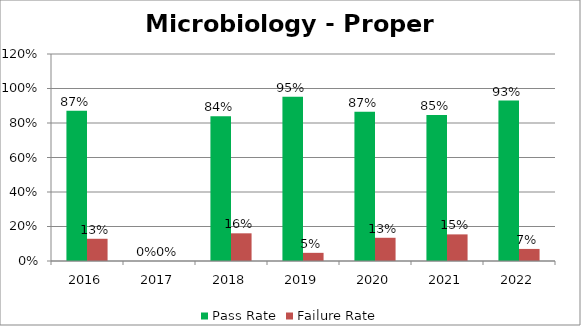
| Category | Pass Rate | Failure Rate |
|---|---|---|
| 2016.0 | 0.871 | 0.129 |
| 2017.0 | 0 | 0 |
| 2018.0 | 0.84 | 0.16 |
| 2019.0 | 0.953 | 0.047 |
| 2020.0 | 0.865 | 0.135 |
| 2021.0 | 0.846 | 0.154 |
| 2022.0 | 0.93 | 0.07 |